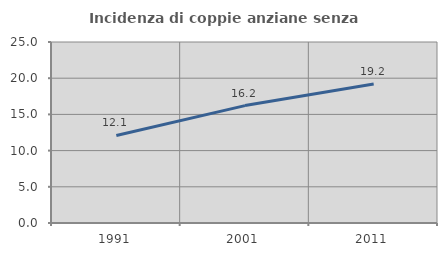
| Category | Incidenza di coppie anziane senza figli  |
|---|---|
| 1991.0 | 12.097 |
| 2001.0 | 16.216 |
| 2011.0 | 19.192 |